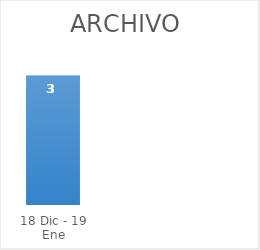
| Category | Series 0 |
|---|---|
| 18 Dic - 19 Ene | 3 |